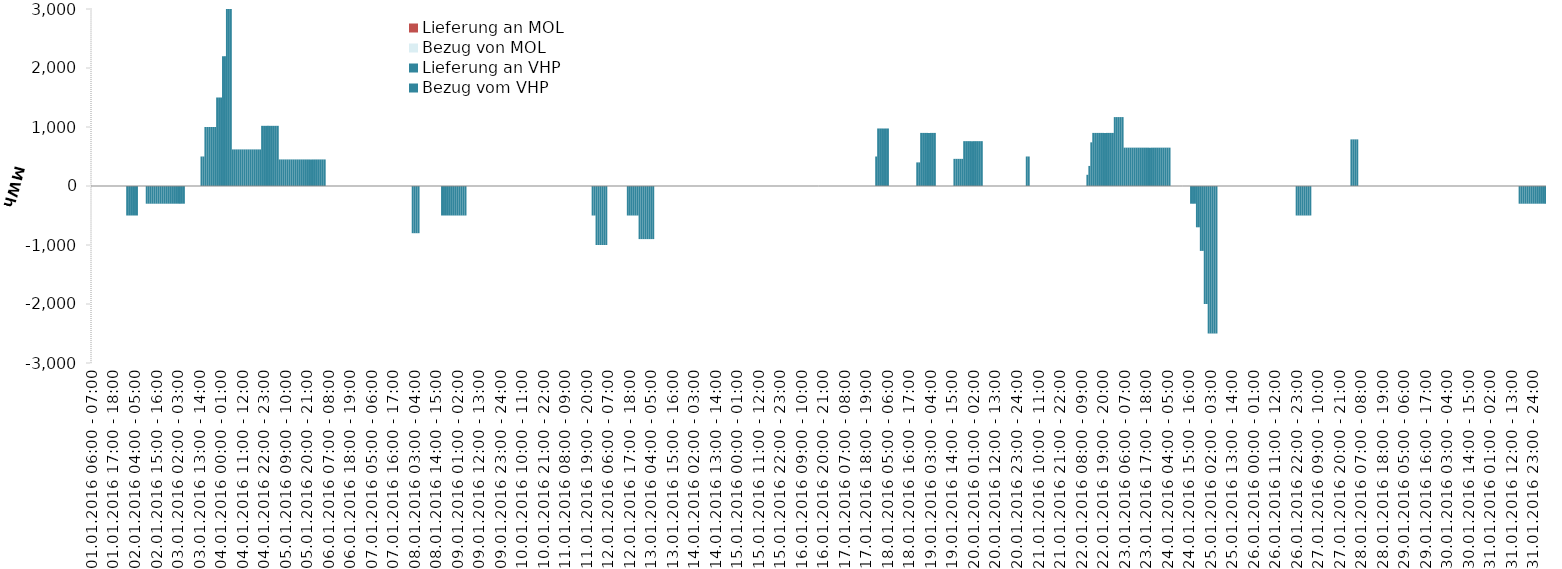
| Category | Bezug vom VHP | Lieferung an VHP | Bezug von MOL | Lieferung an MOL |
|---|---|---|---|---|
| 01.01.2016 06:00 - 07:00 | 0 | 0 | 0 | 0 |
| 01.01.2016 07:00 - 08:00 | 0 | 0 | 0 | 0 |
| 01.01.2016 08:00 - 09:00 | 0 | 0 | 0 | 0 |
| 01.01.2016 09:00 - 10:00 | 0 | 0 | 0 | 0 |
| 01.01.2016 10:00 - 11:00 | 0 | 0 | 0 | 0 |
| 01.01.2016 11:00 - 12:00 | 0 | 0 | 0 | 0 |
| 01.01.2016 12:00 - 13:00 | 0 | 0 | 0 | 0 |
| 01.01.2016 13:00 - 14:00 | 0 | 0 | 0 | 0 |
| 01.01.2016 14:00 - 15:00 | 0 | 0 | 0 | 0 |
| 01.01.2016 15:00 - 16:00 | 0 | 0 | 0 | 0 |
| 01.01.2016 16:00 - 17:00 | 0 | 0 | 0 | 0 |
| 01.01.2016 17:00 - 18:00 | 0 | 0 | 0 | 0 |
| 01.01.2016 18:00 - 19:00 | 0 | 0 | 0 | 0 |
| 01.01.2016 19:00 - 20:00 | 0 | 0 | 0 | 0 |
| 01.01.2016 20:00 - 21:00 | 0 | 0 | 0 | 0 |
| 01.01.2016 21:00 - 22:00 | 0 | 0 | 0 | 0 |
| 01.01.2016 22:00 - 23:00 | 0 | 0 | 0 | 0 |
| 01.01.2016 23:00 - 24:00 | 0 | 0 | 0 | 0 |
| 02.01.2016 00:00 - 01:00 | 0 | -500 | 0 | 0 |
| 02.01.2016 01:00 - 02:00 | 0 | -500 | 0 | 0 |
| 02.01.2016 02:00 - 03:00 | 0 | -500 | 0 | 0 |
| 02.01.2016 03:00 - 04:00 | 0 | -500 | 0 | 0 |
| 02.01.2016 04:00 - 05:00 | 0 | -500 | 0 | 0 |
| 02.01.2016 05:00 - 06:00 | 0 | -500 | 0 | 0 |
| 02.01.2016 06:00 - 07:00 | 0 | 0 | 0 | 0 |
| 02.01.2016 07:00 - 08:00 | 0 | 0 | 0 | 0 |
| 02.01.2016 08:00 - 09:00 | 0 | 0 | 0 | 0 |
| 02.01.2016 09:00 - 10:00 | 0 | 0 | 0 | 0 |
| 02.01.2016 10:00 - 11:00 | 0 | -300 | 0 | 0 |
| 02.01.2016 11:00 - 12:00 | 0 | -300 | 0 | 0 |
| 02.01.2016 12:00 - 13:00 | 0 | -300 | 0 | 0 |
| 02.01.2016 13:00 - 14:00 | 0 | -300 | 0 | 0 |
| 02.01.2016 14:00 - 15:00 | 0 | -300 | 0 | 0 |
| 02.01.2016 15:00 - 16:00 | 0 | -300 | 0 | 0 |
| 02.01.2016 16:00 - 17:00 | 0 | -300 | 0 | 0 |
| 02.01.2016 17:00 - 18:00 | 0 | -300 | 0 | 0 |
| 02.01.2016 18:00 - 19:00 | 0 | -300 | 0 | 0 |
| 02.01.2016 19:00 - 20:00 | 0 | -300 | 0 | 0 |
| 02.01.2016 20:00 - 21:00 | 0 | -300 | 0 | 0 |
| 02.01.2016 21:00 - 22:00 | 0 | -300 | 0 | 0 |
| 02.01.2016 22:00 - 23:00 | 0 | -300 | 0 | 0 |
| 02.01.2016 23:00 - 24:00 | 0 | -300 | 0 | 0 |
| 03.01.2016 00:00 - 01:00 | 0 | -300 | 0 | 0 |
| 03.01.2016 01:00 - 02:00 | 0 | -300 | 0 | 0 |
| 03.01.2016 02:00 - 03:00 | 0 | -300 | 0 | 0 |
| 03.01.2016 03:00 - 04:00 | 0 | -300 | 0 | 0 |
| 03.01.2016 04:00 - 05:00 | 0 | -300 | 0 | 0 |
| 03.01.2016 05:00 - 06:00 | 0 | -300 | 0 | 0 |
| 03.01.2016 06:00 - 07:00 | 0 | 0 | 0 | 0 |
| 03.01.2016 07:00 - 08:00 | 0 | 0 | 0 | 0 |
| 03.01.2016 08:00 - 09:00 | 0 | 0 | 0 | 0 |
| 03.01.2016 09:00 - 10:00 | 0 | 0 | 0 | 0 |
| 03.01.2016 10:00 - 11:00 | 0 | 0 | 0 | 0 |
| 03.01.2016 11:00 - 12:00 | 0 | 0 | 0 | 0 |
| 03.01.2016 12:00 - 13:00 | 0 | 0 | 0 | 0 |
| 03.01.2016 13:00 - 14:00 | 0 | 0 | 0 | 0 |
| 03.01.2016 14:00 - 15:00 | 500 | 0 | 0 | 0 |
| 03.01.2016 15:00 - 16:00 | 500 | 0 | 0 | 0 |
| 03.01.2016 16:00 - 17:00 | 1000 | 0 | 0 | 0 |
| 03.01.2016 17:00 - 18:00 | 1000 | 0 | 0 | 0 |
| 03.01.2016 18:00 - 19:00 | 1000 | 0 | 0 | 0 |
| 03.01.2016 19:00 - 20:00 | 1000 | 0 | 0 | 0 |
| 03.01.2016 20:00 - 21:00 | 1000 | 0 | 0 | 0 |
| 03.01.2016 21:00 - 22:00 | 1000 | 0 | 0 | 0 |
| 03.01.2016 22:00 - 23:00 | 1500 | 0 | 0 | 0 |
| 03.01.2016 23:00 - 24:00 | 1500 | 0 | 0 | 0 |
| 04.01.2016 00:00 - 01:00 | 1500 | 0 | 0 | 0 |
| 04.01.2016 01:00 - 02:00 | 2200 | 0 | 0 | 0 |
| 04.01.2016 02:00 - 03:00 | 2200 | 0 | 0 | 0 |
| 04.01.2016 03:00 - 04:00 | 3100 | 0 | 0 | 0 |
| 04.01.2016 04:00 - 05:00 | 3100 | 0 | 0 | 0 |
| 04.01.2016 05:00 - 06:00 | 3100 | 0 | 0 | 0 |
| 04.01.2016 06:00 - 07:00 | 620 | 0 | 0 | 0 |
| 04.01.2016 07:00 - 08:00 | 620 | 0 | 0 | 0 |
| 04.01.2016 08:00 - 09:00 | 620 | 0 | 0 | 0 |
| 04.01.2016 09:00 - 10:00 | 620 | 0 | 0 | 0 |
| 04.01.2016 10:00 - 11:00 | 620 | 0 | 0 | 0 |
| 04.01.2016 11:00 - 12:00 | 620 | 0 | 0 | 0 |
| 04.01.2016 12:00 - 13:00 | 620 | 0 | 0 | 0 |
| 04.01.2016 13:00 - 14:00 | 620 | 0 | 0 | 0 |
| 04.01.2016 14:00 - 15:00 | 620 | 0 | 0 | 0 |
| 04.01.2016 15:00 - 16:00 | 620 | 0 | 0 | 0 |
| 04.01.2016 16:00 - 17:00 | 620 | 0 | 0 | 0 |
| 04.01.2016 17:00 - 18:00 | 620 | 0 | 0 | 0 |
| 04.01.2016 18:00 - 19:00 | 620 | 0 | 0 | 0 |
| 04.01.2016 19:00 - 20:00 | 620 | 0 | 0 | 0 |
| 04.01.2016 20:00 - 21:00 | 620 | 0 | 0 | 0 |
| 04.01.2016 21:00 - 22:00 | 1020 | 0 | 0 | 0 |
| 04.01.2016 22:00 - 23:00 | 1020 | 0 | 0 | 0 |
| 04.01.2016 23:00 - 24:00 | 1020 | 0 | 0 | 0 |
| 05.01.2016 00:00 - 01:00 | 1020 | 0 | 0 | 0 |
| 05.01.2016 01:00 - 02:00 | 1020 | 0 | 0 | 0 |
| 05.01.2016 02:00 - 03:00 | 1020 | 0 | 0 | 0 |
| 05.01.2016 03:00 - 04:00 | 1020 | 0 | 0 | 0 |
| 05.01.2016 04:00 - 05:00 | 1020 | 0 | 0 | 0 |
| 05.01.2016 05:00 - 06:00 | 1020 | 0 | 0 | 0 |
| 05.01.2016 06:00 - 07:00 | 450 | 0 | 0 | 0 |
| 05.01.2016 07:00 - 08:00 | 450 | 0 | 0 | 0 |
| 05.01.2016 08:00 - 09:00 | 450 | 0 | 0 | 0 |
| 05.01.2016 09:00 - 10:00 | 450 | 0 | 0 | 0 |
| 05.01.2016 10:00 - 11:00 | 450 | 0 | 0 | 0 |
| 05.01.2016 11:00 - 12:00 | 450 | 0 | 0 | 0 |
| 05.01.2016 12:00 - 13:00 | 450 | 0 | 0 | 0 |
| 05.01.2016 13:00 - 14:00 | 450 | 0 | 0 | 0 |
| 05.01.2016 14:00 - 15:00 | 450 | 0 | 0 | 0 |
| 05.01.2016 15:00 - 16:00 | 450 | 0 | 0 | 0 |
| 05.01.2016 16:00 - 17:00 | 450 | 0 | 0 | 0 |
| 05.01.2016 17:00 - 18:00 | 450 | 0 | 0 | 0 |
| 05.01.2016 18:00 - 19:00 | 450 | 0 | 0 | 0 |
| 05.01.2016 19:00 - 20:00 | 450 | 0 | 0 | 0 |
| 05.01.2016 20:00 - 21:00 | 450 | 0 | 0 | 0 |
| 05.01.2016 21:00 - 22:00 | 450 | 0 | 0 | 0 |
| 05.01.2016 22:00 - 23:00 | 450 | 0 | 0 | 0 |
| 05.01.2016 23:00 - 24:00 | 450 | 0 | 0 | 0 |
| 06.01.2016 00:00 - 01:00 | 450 | 0 | 0 | 0 |
| 06.01.2016 01:00 - 02:00 | 450 | 0 | 0 | 0 |
| 06.01.2016 02:00 - 03:00 | 450 | 0 | 0 | 0 |
| 06.01.2016 03:00 - 04:00 | 450 | 0 | 0 | 0 |
| 06.01.2016 04:00 - 05:00 | 450 | 0 | 0 | 0 |
| 06.01.2016 05:00 - 06:00 | 450 | 0 | 0 | 0 |
| 06.01.2016 06:00 - 07:00 | 0 | 0 | 0 | 0 |
| 06.01.2016 07:00 - 08:00 | 0 | 0 | 0 | 0 |
| 06.01.2016 08:00 - 09:00 | 0 | 0 | 0 | 0 |
| 06.01.2016 09:00 - 10:00 | 0 | 0 | 0 | 0 |
| 06.01.2016 10:00 - 11:00 | 0 | 0 | 0 | 0 |
| 06.01.2016 11:00 - 12:00 | 0 | 0 | 0 | 0 |
| 06.01.2016 12:00 - 13:00 | 0 | 0 | 0 | 0 |
| 06.01.2016 13:00 - 14:00 | 0 | 0 | 0 | 0 |
| 06.01.2016 14:00 - 15:00 | 0 | 0 | 0 | 0 |
| 06.01.2016 15:00 - 16:00 | 0 | 0 | 0 | 0 |
| 06.01.2016 16:00 - 17:00 | 0 | 0 | 0 | 0 |
| 06.01.2016 17:00 - 18:00 | 0 | 0 | 0 | 0 |
| 06.01.2016 18:00 - 19:00 | 0 | 0 | 0 | 0 |
| 06.01.2016 19:00 - 20:00 | 0 | 0 | 0 | 0 |
| 06.01.2016 20:00 - 21:00 | 0 | 0 | 0 | 0 |
| 06.01.2016 21:00 - 22:00 | 0 | 0 | 0 | 0 |
| 06.01.2016 22:00 - 23:00 | 0 | 0 | 0 | 0 |
| 06.01.2016 23:00 - 24:00 | 0 | 0 | 0 | 0 |
| 07.01.2016 00:00 - 01:00 | 0 | 0 | 0 | 0 |
| 07.01.2016 01:00 - 02:00 | 0 | 0 | 0 | 0 |
| 07.01.2016 02:00 - 03:00 | 0 | 0 | 0 | 0 |
| 07.01.2016 03:00 - 04:00 | 0 | 0 | 0 | 0 |
| 07.01.2016 04:00 - 05:00 | 0 | 0 | 0 | 0 |
| 07.01.2016 05:00 - 06:00 | 0 | 0 | 0 | 0 |
| 07.01.2016 06:00 - 07:00 | 0 | 0 | 0 | 0 |
| 07.01.2016 07:00 - 08:00 | 0 | 0 | 0 | 0 |
| 07.01.2016 08:00 - 09:00 | 0 | 0 | 0 | 0 |
| 07.01.2016 09:00 - 10:00 | 0 | 0 | 0 | 0 |
| 07.01.2016 10:00 - 11:00 | 0 | 0 | 0 | 0 |
| 07.01.2016 11:00 - 12:00 | 0 | 0 | 0 | 0 |
| 07.01.2016 12:00 - 13:00 | 0 | 0 | 0 | 0 |
| 07.01.2016 13:00 - 14:00 | 0 | 0 | 0 | 0 |
| 07.01.2016 14:00 - 15:00 | 0 | 0 | 0 | 0 |
| 07.01.2016 15:00 - 16:00 | 0 | 0 | 0 | 0 |
| 07.01.2016 16:00 - 17:00 | 0 | 0 | 0 | 0 |
| 07.01.2016 17:00 - 18:00 | 0 | 0 | 0 | 0 |
| 07.01.2016 18:00 - 19:00 | 0 | 0 | 0 | 0 |
| 07.01.2016 19:00 - 20:00 | 0 | 0 | 0 | 0 |
| 07.01.2016 20:00 - 21:00 | 0 | 0 | 0 | 0 |
| 07.01.2016 21:00 - 22:00 | 0 | 0 | 0 | 0 |
| 07.01.2016 22:00 - 23:00 | 0 | 0 | 0 | 0 |
| 07.01.2016 23:00 - 24:00 | 0 | 0 | 0 | 0 |
| 08.01.2016 00:00 - 01:00 | 0 | 0 | 0 | 0 |
| 08.01.2016 01:00 - 02:00 | 0 | 0 | 0 | 0 |
| 08.01.2016 02:00 - 03:00 | 0 | -800 | 0 | 0 |
| 08.01.2016 03:00 - 04:00 | 0 | -800 | 0 | 0 |
| 08.01.2016 04:00 - 05:00 | 0 | -800 | 0 | 0 |
| 08.01.2016 05:00 - 06:00 | 0 | -800 | 0 | 0 |
| 08.01.2016 06:00 - 07:00 | 0 | 0 | 0 | 0 |
| 08.01.2016 07:00 - 08:00 | 0 | 0 | 0 | 0 |
| 08.01.2016 08:00 - 09:00 | 0 | 0 | 0 | 0 |
| 08.01.2016 09:00 - 10:00 | 0 | 0 | 0 | 0 |
| 08.01.2016 10:00 - 11:00 | 0 | 0 | 0 | 0 |
| 08.01.2016 11:00 - 12:00 | 0 | 0 | 0 | 0 |
| 08.01.2016 12:00 - 13:00 | 0 | 0 | 0 | 0 |
| 08.01.2016 13:00 - 14:00 | 0 | 0 | 0 | 0 |
| 08.01.2016 14:00 - 15:00 | 0 | 0 | 0 | 0 |
| 08.01.2016 15:00 - 16:00 | 0 | 0 | 0 | 0 |
| 08.01.2016 16:00 - 17:00 | 0 | 0 | 0 | 0 |
| 08.01.2016 17:00 - 18:00 | 0 | -500 | 0 | 0 |
| 08.01.2016 18:00 - 19:00 | 0 | -500 | 0 | 0 |
| 08.01.2016 19:00 - 20:00 | 0 | -500 | 0 | 0 |
| 08.01.2016 20:00 - 21:00 | 0 | -500 | 0 | 0 |
| 08.01.2016 21:00 - 22:00 | 0 | -500 | 0 | 0 |
| 08.01.2016 22:00 - 23:00 | 0 | -500 | 0 | 0 |
| 08.01.2016 23:00 - 24:00 | 0 | -500 | 0 | 0 |
| 09.01.2016 00:00 - 01:00 | 0 | -500 | 0 | 0 |
| 09.01.2016 01:00 - 02:00 | 0 | -500 | 0 | 0 |
| 09.01.2016 02:00 - 03:00 | 0 | -500 | 0 | 0 |
| 09.01.2016 03:00 - 04:00 | 0 | -500 | 0 | 0 |
| 09.01.2016 04:00 - 05:00 | 0 | -500 | 0 | 0 |
| 09.01.2016 05:00 - 06:00 | 0 | -500 | 0 | 0 |
| 09.01.2016 06:00 - 07:00 | 0 | 0 | 0 | 0 |
| 09.01.2016 07:00 - 08:00 | 0 | 0 | 0 | 0 |
| 09.01.2016 08:00 - 09:00 | 0 | 0 | 0 | 0 |
| 09.01.2016 09:00 - 10:00 | 0 | 0 | 0 | 0 |
| 09.01.2016 10:00 - 11:00 | 0 | 0 | 0 | 0 |
| 09.01.2016 11:00 - 12:00 | 0 | 0 | 0 | 0 |
| 09.01.2016 12:00 - 13:00 | 0 | 0 | 0 | 0 |
| 09.01.2016 13:00 - 14:00 | 0 | 0 | 0 | 0 |
| 09.01.2016 14:00 - 15:00 | 0 | 0 | 0 | 0 |
| 09.01.2016 15:00 - 16:00 | 0 | 0 | 0 | 0 |
| 09.01.2016 16:00 - 17:00 | 0 | 0 | 0 | 0 |
| 09.01.2016 17:00 - 18:00 | 0 | 0 | 0 | 0 |
| 09.01.2016 18:00 - 19:00 | 0 | 0 | 0 | 0 |
| 09.01.2016 19:00 - 20:00 | 0 | 0 | 0 | 0 |
| 09.01.2016 20:00 - 21:00 | 0 | 0 | 0 | 0 |
| 09.01.2016 21:00 - 22:00 | 0 | 0 | 0 | 0 |
| 09.01.2016 22:00 - 23:00 | 0 | 0 | 0 | 0 |
| 09.01.2016 23:00 - 24:00 | 0 | 0 | 0 | 0 |
| 10.01.2016 00:00 - 01:00 | 0 | 0 | 0 | 0 |
| 10.01.2016 01:00 - 02:00 | 0 | 0 | 0 | 0 |
| 10.01.2016 02:00 - 03:00 | 0 | 0 | 0 | 0 |
| 10.01.2016 03:00 - 04:00 | 0 | 0 | 0 | 0 |
| 10.01.2016 04:00 - 05:00 | 0 | 0 | 0 | 0 |
| 10.01.2016 05:00 - 06:00 | 0 | 0 | 0 | 0 |
| 10.01.2016 06:00 - 07:00 | 0 | 0 | 0 | 0 |
| 10.01.2016 07:00 - 08:00 | 0 | 0 | 0 | 0 |
| 10.01.2016 08:00 - 09:00 | 0 | 0 | 0 | 0 |
| 10.01.2016 09:00 - 10:00 | 0 | 0 | 0 | 0 |
| 10.01.2016 10:00 - 11:00 | 0 | 0 | 0 | 0 |
| 10.01.2016 11:00 - 12:00 | 0 | 0 | 0 | 0 |
| 10.01.2016 12:00 - 13:00 | 0 | 0 | 0 | 0 |
| 10.01.2016 13:00 - 14:00 | 0 | 0 | 0 | 0 |
| 10.01.2016 14:00 - 15:00 | 0 | 0 | 0 | 0 |
| 10.01.2016 15:00 - 16:00 | 0 | 0 | 0 | 0 |
| 10.01.2016 16:00 - 17:00 | 0 | 0 | 0 | 0 |
| 10.01.2016 17:00 - 18:00 | 0 | 0 | 0 | 0 |
| 10.01.2016 18:00 - 19:00 | 0 | 0 | 0 | 0 |
| 10.01.2016 19:00 - 20:00 | 0 | 0 | 0 | 0 |
| 10.01.2016 20:00 - 21:00 | 0 | 0 | 0 | 0 |
| 10.01.2016 21:00 - 22:00 | 0 | 0 | 0 | 0 |
| 10.01.2016 22:00 - 23:00 | 0 | 0 | 0 | 0 |
| 10.01.2016 23:00 - 24:00 | 0 | 0 | 0 | 0 |
| 11.01.2016 00:00 - 01:00 | 0 | 0 | 0 | 0 |
| 11.01.2016 01:00 - 02:00 | 0 | 0 | 0 | 0 |
| 11.01.2016 02:00 - 03:00 | 0 | 0 | 0 | 0 |
| 11.01.2016 03:00 - 04:00 | 0 | 0 | 0 | 0 |
| 11.01.2016 04:00 - 05:00 | 0 | 0 | 0 | 0 |
| 11.01.2016 05:00 - 06:00 | 0 | 0 | 0 | 0 |
| 11.01.2016 06:00 - 07:00 | 0 | 0 | 0 | 0 |
| 11.01.2016 07:00 - 08:00 | 0 | 0 | 0 | 0 |
| 11.01.2016 08:00 - 09:00 | 0 | 0 | 0 | 0 |
| 11.01.2016 09:00 - 10:00 | 0 | 0 | 0 | 0 |
| 11.01.2016 10:00 - 11:00 | 0 | 0 | 0 | 0 |
| 11.01.2016 11:00 - 12:00 | 0 | 0 | 0 | 0 |
| 11.01.2016 12:00 - 13:00 | 0 | 0 | 0 | 0 |
| 11.01.2016 13:00 - 14:00 | 0 | 0 | 0 | 0 |
| 11.01.2016 14:00 - 15:00 | 0 | 0 | 0 | 0 |
| 11.01.2016 15:00 - 16:00 | 0 | 0 | 0 | 0 |
| 11.01.2016 16:00 - 17:00 | 0 | 0 | 0 | 0 |
| 11.01.2016 17:00 - 18:00 | 0 | 0 | 0 | 0 |
| 11.01.2016 18:00 - 19:00 | 0 | 0 | 0 | 0 |
| 11.01.2016 19:00 - 20:00 | 0 | 0 | 0 | 0 |
| 11.01.2016 20:00 - 21:00 | 0 | 0 | 0 | 0 |
| 11.01.2016 21:00 - 22:00 | 0 | 0 | 0 | 0 |
| 11.01.2016 22:00 - 23:00 | 0 | -500 | 0 | 0 |
| 11.01.2016 23:00 - 24:00 | 0 | -500 | 0 | 0 |
| 12.01.2016 00:00 - 01:00 | 0 | -1000 | 0 | 0 |
| 12.01.2016 01:00 - 02:00 | 0 | -1000 | 0 | 0 |
| 12.01.2016 02:00 - 03:00 | 0 | -1000 | 0 | 0 |
| 12.01.2016 03:00 - 04:00 | 0 | -1000 | 0 | 0 |
| 12.01.2016 04:00 - 05:00 | 0 | -1000 | 0 | 0 |
| 12.01.2016 05:00 - 06:00 | 0 | -1000 | 0 | 0 |
| 12.01.2016 06:00 - 07:00 | 0 | 0 | 0 | 0 |
| 12.01.2016 07:00 - 08:00 | 0 | 0 | 0 | 0 |
| 12.01.2016 08:00 - 09:00 | 0 | 0 | 0 | 0 |
| 12.01.2016 09:00 - 10:00 | 0 | 0 | 0 | 0 |
| 12.01.2016 10:00 - 11:00 | 0 | 0 | 0 | 0 |
| 12.01.2016 11:00 - 12:00 | 0 | 0 | 0 | 0 |
| 12.01.2016 12:00 - 13:00 | 0 | 0 | 0 | 0 |
| 12.01.2016 13:00 - 14:00 | 0 | 0 | 0 | 0 |
| 12.01.2016 14:00 - 15:00 | 0 | 0 | 0 | 0 |
| 12.01.2016 15:00 - 16:00 | 0 | 0 | 0 | 0 |
| 12.01.2016 16:00 - 17:00 | 0 | -500 | 0 | 0 |
| 12.01.2016 17:00 - 18:00 | 0 | -500 | 0 | 0 |
| 12.01.2016 18:00 - 19:00 | 0 | -500 | 0 | 0 |
| 12.01.2016 19:00 - 20:00 | 0 | -500 | 0 | 0 |
| 12.01.2016 20:00 - 21:00 | 0 | -500 | 0 | 0 |
| 12.01.2016 21:00 - 22:00 | 0 | -500 | 0 | 0 |
| 12.01.2016 22:00 - 23:00 | 0 | -900 | 0 | 0 |
| 12.01.2016 23:00 - 24:00 | 0 | -900 | 0 | 0 |
| 13.01.2016 00:00 - 01:00 | 0 | -900 | 0 | 0 |
| 13.01.2016 01:00 - 02:00 | 0 | -900 | 0 | 0 |
| 13.01.2016 02:00 - 03:00 | 0 | -900 | 0 | 0 |
| 13.01.2016 03:00 - 04:00 | 0 | -900 | 0 | 0 |
| 13.01.2016 04:00 - 05:00 | 0 | -900 | 0 | 0 |
| 13.01.2016 05:00 - 06:00 | 0 | -900 | 0 | 0 |
| 13.01.2016 06:00 - 07:00 | 0 | 0 | 0 | 0 |
| 13.01.2016 07:00 - 08:00 | 0 | 0 | 0 | 0 |
| 13.01.2016 08:00 - 09:00 | 0 | 0 | 0 | 0 |
| 13.01.2016 09:00 - 10:00 | 0 | 0 | 0 | 0 |
| 13.01.2016 10:00 - 11:00 | 0 | 0 | 0 | 0 |
| 13.01.2016 11:00 - 12:00 | 0 | 0 | 0 | 0 |
| 13.01.2016 12:00 - 13:00 | 0 | 0 | 0 | 0 |
| 13.01.2016 13:00 - 14:00 | 0 | 0 | 0 | 0 |
| 13.01.2016 14:00 - 15:00 | 0 | 0 | 0 | 0 |
| 13.01.2016 15:00 - 16:00 | 0 | 0 | 0 | 0 |
| 13.01.2016 16:00 - 17:00 | 0 | 0 | 0 | 0 |
| 13.01.2016 17:00 - 18:00 | 0 | 0 | 0 | 0 |
| 13.01.2016 18:00 - 19:00 | 0 | 0 | 0 | 0 |
| 13.01.2016 19:00 - 20:00 | 0 | 0 | 0 | 0 |
| 13.01.2016 20:00 - 21:00 | 0 | 0 | 0 | 0 |
| 13.01.2016 21:00 - 22:00 | 0 | 0 | 0 | 0 |
| 13.01.2016 22:00 - 23:00 | 0 | 0 | 0 | 0 |
| 13.01.2016 23:00 - 24:00 | 0 | 0 | 0 | 0 |
| 14.01.2016 00:00 - 01:00 | 0 | 0 | 0 | 0 |
| 14.01.2016 01:00 - 02:00 | 0 | 0 | 0 | 0 |
| 14.01.2016 02:00 - 03:00 | 0 | 0 | 0 | 0 |
| 14.01.2016 03:00 - 04:00 | 0 | 0 | 0 | 0 |
| 14.01.2016 04:00 - 05:00 | 0 | 0 | 0 | 0 |
| 14.01.2016 05:00 - 06:00 | 0 | 0 | 0 | 0 |
| 14.01.2016 06:00 - 07:00 | 0 | 0 | 0 | 0 |
| 14.01.2016 07:00 - 08:00 | 0 | 0 | 0 | 0 |
| 14.01.2016 08:00 - 09:00 | 0 | 0 | 0 | 0 |
| 14.01.2016 09:00 - 10:00 | 0 | 0 | 0 | 0 |
| 14.01.2016 10:00 - 11:00 | 0 | 0 | 0 | 0 |
| 14.01.2016 11:00 - 12:00 | 0 | 0 | 0 | 0 |
| 14.01.2016 12:00 - 13:00 | 0 | 0 | 0 | 0 |
| 14.01.2016 13:00 - 14:00 | 0 | 0 | 0 | 0 |
| 14.01.2016 14:00 - 15:00 | 0 | 0 | 0 | 0 |
| 14.01.2016 15:00 - 16:00 | 0 | 0 | 0 | 0 |
| 14.01.2016 16:00 - 17:00 | 0 | 0 | 0 | 0 |
| 14.01.2016 17:00 - 18:00 | 0 | 0 | 0 | 0 |
| 14.01.2016 18:00 - 19:00 | 0 | 0 | 0 | 0 |
| 14.01.2016 19:00 - 20:00 | 0 | 0 | 0 | 0 |
| 14.01.2016 20:00 - 21:00 | 0 | 0 | 0 | 0 |
| 14.01.2016 21:00 - 22:00 | 0 | 0 | 0 | 0 |
| 14.01.2016 22:00 - 23:00 | 0 | 0 | 0 | 0 |
| 14.01.2016 23:00 - 24:00 | 0 | 0 | 0 | 0 |
| 15.01.2016 00:00 - 01:00 | 0 | 0 | 0 | 0 |
| 15.01.2016 01:00 - 02:00 | 0 | 0 | 0 | 0 |
| 15.01.2016 02:00 - 03:00 | 0 | 0 | 0 | 0 |
| 15.01.2016 03:00 - 04:00 | 0 | 0 | 0 | 0 |
| 15.01.2016 04:00 - 05:00 | 0 | 0 | 0 | 0 |
| 15.01.2016 05:00 - 06:00 | 0 | 0 | 0 | 0 |
| 15.01.2016 06:00 - 07:00 | 0 | 0 | 0 | 0 |
| 15.01.2016 07:00 - 08:00 | 0 | 0 | 0 | 0 |
| 15.01.2016 08:00 - 09:00 | 0 | 0 | 0 | 0 |
| 15.01.2016 09:00 - 10:00 | 0 | 0 | 0 | 0 |
| 15.01.2016 10:00 - 11:00 | 0 | 0 | 0 | 0 |
| 15.01.2016 11:00 - 12:00 | 0 | 0 | 0 | 0 |
| 15.01.2016 12:00 - 13:00 | 0 | 0 | 0 | 0 |
| 15.01.2016 13:00 - 14:00 | 0 | 0 | 0 | 0 |
| 15.01.2016 14:00 - 15:00 | 0 | 0 | 0 | 0 |
| 15.01.2016 15:00 - 16:00 | 0 | 0 | 0 | 0 |
| 15.01.2016 16:00 - 17:00 | 0 | 0 | 0 | 0 |
| 15.01.2016 17:00 - 18:00 | 0 | 0 | 0 | 0 |
| 15.01.2016 18:00 - 19:00 | 0 | 0 | 0 | 0 |
| 15.01.2016 19:00 - 20:00 | 0 | 0 | 0 | 0 |
| 15.01.2016 20:00 - 21:00 | 0 | 0 | 0 | 0 |
| 15.01.2016 21:00 - 22:00 | 0 | 0 | 0 | 0 |
| 15.01.2016 22:00 - 23:00 | 0 | 0 | 0 | 0 |
| 15.01.2016 23:00 - 24:00 | 0 | 0 | 0 | 0 |
| 16.01.2016 00:00 - 01:00 | 0 | 0 | 0 | 0 |
| 16.01.2016 01:00 - 02:00 | 0 | 0 | 0 | 0 |
| 16.01.2016 02:00 - 03:00 | 0 | 0 | 0 | 0 |
| 16.01.2016 03:00 - 04:00 | 0 | 0 | 0 | 0 |
| 16.01.2016 04:00 - 05:00 | 0 | 0 | 0 | 0 |
| 16.01.2016 05:00 - 06:00 | 0 | 0 | 0 | 0 |
| 16.01.2016 06:00 - 07:00 | 0 | 0 | 0 | 0 |
| 16.01.2016 07:00 - 08:00 | 0 | 0 | 0 | 0 |
| 16.01.2016 08:00 - 09:00 | 0 | 0 | 0 | 0 |
| 16.01.2016 09:00 - 10:00 | 0 | 0 | 0 | 0 |
| 16.01.2016 10:00 - 11:00 | 0 | 0 | 0 | 0 |
| 16.01.2016 11:00 - 12:00 | 0 | 0 | 0 | 0 |
| 16.01.2016 12:00 - 13:00 | 0 | 0 | 0 | 0 |
| 16.01.2016 13:00 - 14:00 | 0 | 0 | 0 | 0 |
| 16.01.2016 14:00 - 15:00 | 0 | 0 | 0 | 0 |
| 16.01.2016 15:00 - 16:00 | 0 | 0 | 0 | 0 |
| 16.01.2016 16:00 - 17:00 | 0 | 0 | 0 | 0 |
| 16.01.2016 17:00 - 18:00 | 0 | 0 | 0 | 0 |
| 16.01.2016 18:00 - 19:00 | 0 | 0 | 0 | 0 |
| 16.01.2016 19:00 - 20:00 | 0 | 0 | 0 | 0 |
| 16.01.2016 20:00 - 21:00 | 0 | 0 | 0 | 0 |
| 16.01.2016 21:00 - 22:00 | 0 | 0 | 0 | 0 |
| 16.01.2016 22:00 - 23:00 | 0 | 0 | 0 | 0 |
| 16.01.2016 23:00 - 24:00 | 0 | 0 | 0 | 0 |
| 17.01.2016 00:00 - 01:00 | 0 | 0 | 0 | 0 |
| 17.01.2016 01:00 - 02:00 | 0 | 0 | 0 | 0 |
| 17.01.2016 02:00 - 03:00 | 0 | 0 | 0 | 0 |
| 17.01.2016 03:00 - 04:00 | 0 | 0 | 0 | 0 |
| 17.01.2016 04:00 - 05:00 | 0 | 0 | 0 | 0 |
| 17.01.2016 05:00 - 06:00 | 0 | 0 | 0 | 0 |
| 17.01.2016 06:00 - 07:00 | 0 | 0 | 0 | 0 |
| 17.01.2016 07:00 - 08:00 | 0 | 0 | 0 | 0 |
| 17.01.2016 08:00 - 09:00 | 0 | 0 | 0 | 0 |
| 17.01.2016 09:00 - 10:00 | 0 | 0 | 0 | 0 |
| 17.01.2016 10:00 - 11:00 | 0 | 0 | 0 | 0 |
| 17.01.2016 11:00 - 12:00 | 0 | 0 | 0 | 0 |
| 17.01.2016 12:00 - 13:00 | 0 | 0 | 0 | 0 |
| 17.01.2016 13:00 - 14:00 | 0 | 0 | 0 | 0 |
| 17.01.2016 14:00 - 15:00 | 0 | 0 | 0 | 0 |
| 17.01.2016 15:00 - 16:00 | 0 | 0 | 0 | 0 |
| 17.01.2016 16:00 - 17:00 | 0 | 0 | 0 | 0 |
| 17.01.2016 17:00 - 18:00 | 0 | 0 | 0 | 0 |
| 17.01.2016 18:00 - 19:00 | 0 | 0 | 0 | 0 |
| 17.01.2016 19:00 - 20:00 | 0 | 0 | 0 | 0 |
| 17.01.2016 20:00 - 21:00 | 0 | 0 | 0 | 0 |
| 17.01.2016 21:00 - 22:00 | 0 | 0 | 0 | 0 |
| 17.01.2016 22:00 - 23:00 | 0 | 0 | 0 | 0 |
| 17.01.2016 23:00 - 24:00 | 500 | 0 | 0 | 0 |
| 18.01.2016 00:00 - 01:00 | 975 | 0 | 0 | 0 |
| 18.01.2016 01:00 - 02:00 | 975 | 0 | 0 | 0 |
| 18.01.2016 02:00 - 03:00 | 975 | 0 | 0 | 0 |
| 18.01.2016 03:00 - 04:00 | 975 | 0 | 0 | 0 |
| 18.01.2016 04:00 - 05:00 | 975 | 0 | 0 | 0 |
| 18.01.2016 05:00 - 06:00 | 975 | 0 | 0 | 0 |
| 18.01.2016 06:00 - 07:00 | 0 | 0 | 0 | 0 |
| 18.01.2016 07:00 - 08:00 | 0 | 0 | 0 | 0 |
| 18.01.2016 08:00 - 09:00 | 0 | 0 | 0 | 0 |
| 18.01.2016 09:00 - 10:00 | 0 | 0 | 0 | 0 |
| 18.01.2016 10:00 - 11:00 | 0 | 0 | 0 | 0 |
| 18.01.2016 11:00 - 12:00 | 0 | 0 | 0 | 0 |
| 18.01.2016 12:00 - 13:00 | 0 | 0 | 0 | 0 |
| 18.01.2016 13:00 - 14:00 | 0 | 0 | 0 | 0 |
| 18.01.2016 14:00 - 15:00 | 0 | 0 | 0 | 0 |
| 18.01.2016 15:00 - 16:00 | 0 | 0 | 0 | 0 |
| 18.01.2016 16:00 - 17:00 | 0 | 0 | 0 | 0 |
| 18.01.2016 17:00 - 18:00 | 0 | 0 | 0 | 0 |
| 18.01.2016 18:00 - 19:00 | 0 | 0 | 0 | 0 |
| 18.01.2016 19:00 - 20:00 | 0 | 0 | 0 | 0 |
| 18.01.2016 20:00 - 21:00 | 400 | 0 | 0 | 0 |
| 18.01.2016 21:00 - 22:00 | 400 | 0 | 0 | 0 |
| 18.01.2016 22:00 - 23:00 | 900 | 0 | 0 | 0 |
| 18.01.2016 23:00 - 24:00 | 900 | 0 | 0 | 0 |
| 19.01.2016 00:00 - 01:00 | 900 | 0 | 0 | 0 |
| 19.01.2016 01:00 - 02:00 | 900 | 0 | 0 | 0 |
| 19.01.2016 02:00 - 03:00 | 900 | 0 | 0 | 0 |
| 19.01.2016 03:00 - 04:00 | 900 | 0 | 0 | 0 |
| 19.01.2016 04:00 - 05:00 | 900 | 0 | 0 | 0 |
| 19.01.2016 05:00 - 06:00 | 900 | 0 | 0 | 0 |
| 19.01.2016 06:00 - 07:00 | 0 | 0 | 0 | 0 |
| 19.01.2016 07:00 - 08:00 | 0 | 0 | 0 | 0 |
| 19.01.2016 08:00 - 09:00 | 0 | 0 | 0 | 0 |
| 19.01.2016 09:00 - 10:00 | 0 | 0 | 0 | 0 |
| 19.01.2016 10:00 - 11:00 | 0 | 0 | 0 | 0 |
| 19.01.2016 11:00 - 12:00 | 0 | 0 | 0 | 0 |
| 19.01.2016 12:00 - 13:00 | 0 | 0 | 0 | 0 |
| 19.01.2016 13:00 - 14:00 | 0 | 0 | 0 | 0 |
| 19.01.2016 14:00 - 15:00 | 0 | 0 | 0 | 0 |
| 19.01.2016 15:00 - 16:00 | 460 | 0 | 0 | 0 |
| 19.01.2016 16:00 - 17:00 | 460 | 0 | 0 | 0 |
| 19.01.2016 17:00 - 18:00 | 460 | 0 | 0 | 0 |
| 19.01.2016 18:00 - 19:00 | 460 | 0 | 0 | 0 |
| 19.01.2016 19:00 - 20:00 | 460 | 0 | 0 | 0 |
| 19.01.2016 20:00 - 21:00 | 760 | 0 | 0 | 0 |
| 19.01.2016 21:00 - 22:00 | 760 | 0 | 0 | 0 |
| 19.01.2016 22:00 - 23:00 | 760 | 0 | 0 | 0 |
| 19.01.2016 23:00 - 24:00 | 760 | 0 | 0 | 0 |
| 20.01.2016 00:00 - 01:00 | 760 | 0 | 0 | 0 |
| 20.01.2016 01:00 - 02:00 | 760 | 0 | 0 | 0 |
| 20.01.2016 02:00 - 03:00 | 760 | 0 | 0 | 0 |
| 20.01.2016 03:00 - 04:00 | 760 | 0 | 0 | 0 |
| 20.01.2016 04:00 - 05:00 | 760 | 0 | 0 | 0 |
| 20.01.2016 05:00 - 06:00 | 760 | 0 | 0 | 0 |
| 20.01.2016 06:00 - 07:00 | 0 | 0 | 0 | 0 |
| 20.01.2016 07:00 - 08:00 | 0 | 0 | 0 | 0 |
| 20.01.2016 08:00 - 09:00 | 0 | 0 | 0 | 0 |
| 20.01.2016 09:00 - 10:00 | 0 | 0 | 0 | 0 |
| 20.01.2016 10:00 - 11:00 | 0 | 0 | 0 | 0 |
| 20.01.2016 11:00 - 12:00 | 0 | 0 | 0 | 0 |
| 20.01.2016 12:00 - 13:00 | 0 | 0 | 0 | 0 |
| 20.01.2016 13:00 - 14:00 | 0 | 0 | 0 | 0 |
| 20.01.2016 14:00 - 15:00 | 0 | 0 | 0 | 0 |
| 20.01.2016 15:00 - 16:00 | 0 | 0 | 0 | 0 |
| 20.01.2016 16:00 - 17:00 | 0 | 0 | 0 | 0 |
| 20.01.2016 17:00 - 18:00 | 0 | 0 | 0 | 0 |
| 20.01.2016 18:00 - 19:00 | 0 | 0 | 0 | 0 |
| 20.01.2016 19:00 - 20:00 | 0 | 0 | 0 | 0 |
| 20.01.2016 20:00 - 21:00 | 0 | 0 | 0 | 0 |
| 20.01.2016 21:00 - 22:00 | 0 | 0 | 0 | 0 |
| 20.01.2016 22:00 - 23:00 | 0 | 0 | 0 | 0 |
| 20.01.2016 23:00 - 24:00 | 0 | 0 | 0 | 0 |
| 21.01.2016 00:00 - 01:00 | 0 | 0 | 0 | 0 |
| 21.01.2016 01:00 - 02:00 | 0 | 0 | 0 | 0 |
| 21.01.2016 02:00 - 03:00 | 0 | 0 | 0 | 0 |
| 21.01.2016 03:00 - 04:00 | 0 | 0 | 0 | 0 |
| 21.01.2016 04:00 - 05:00 | 500 | 0 | 0 | 0 |
| 21.01.2016 05:00 - 06:00 | 500 | 0 | 0 | 0 |
| 21.01.2016 06:00 - 07:00 | 0 | 0 | 0 | 0 |
| 21.01.2016 07:00 - 08:00 | 0 | 0 | 0 | 0 |
| 21.01.2016 08:00 - 09:00 | 0 | 0 | 0 | 0 |
| 21.01.2016 09:00 - 10:00 | 0 | 0 | 0 | 0 |
| 21.01.2016 10:00 - 11:00 | 0 | 0 | 0 | 0 |
| 21.01.2016 11:00 - 12:00 | 0 | 0 | 0 | 0 |
| 21.01.2016 12:00 - 13:00 | 0 | 0 | 0 | 0 |
| 21.01.2016 13:00 - 14:00 | 0 | 0 | 0 | 0 |
| 21.01.2016 14:00 - 15:00 | 0 | 0 | 0 | 0 |
| 21.01.2016 15:00 - 16:00 | 0 | 0 | 0 | 0 |
| 21.01.2016 16:00 - 17:00 | 0 | 0 | 0 | 0 |
| 21.01.2016 17:00 - 18:00 | 0 | 0 | 0 | 0 |
| 21.01.2016 18:00 - 19:00 | 0 | 0 | 0 | 0 |
| 21.01.2016 19:00 - 20:00 | 0 | 0 | 0 | 0 |
| 21.01.2016 20:00 - 21:00 | 0 | 0 | 0 | 0 |
| 21.01.2016 21:00 - 22:00 | 0 | 0 | 0 | 0 |
| 21.01.2016 22:00 - 23:00 | 0 | 0 | 0 | 0 |
| 21.01.2016 23:00 - 24:00 | 0 | 0 | 0 | 0 |
| 22.01.2016 00:00 - 01:00 | 0 | 0 | 0 | 0 |
| 22.01.2016 01:00 - 02:00 | 0 | 0 | 0 | 0 |
| 22.01.2016 02:00 - 03:00 | 0 | 0 | 0 | 0 |
| 22.01.2016 03:00 - 04:00 | 0 | 0 | 0 | 0 |
| 22.01.2016 04:00 - 05:00 | 0 | 0 | 0 | 0 |
| 22.01.2016 05:00 - 06:00 | 0 | 0 | 0 | 0 |
| 22.01.2016 06:00 - 07:00 | 0 | 0 | 0 | 0 |
| 22.01.2016 07:00 - 08:00 | 0 | 0 | 0 | 0 |
| 22.01.2016 08:00 - 09:00 | 0 | 0 | 0 | 0 |
| 22.01.2016 09:00 - 10:00 | 0 | 0 | 0 | 0 |
| 22.01.2016 10:00 - 11:00 | 0 | 0 | 0 | 0 |
| 22.01.2016 11:00 - 12:00 | 190 | 0 | 0 | 0 |
| 22.01.2016 12:00 - 13:00 | 340 | 0 | 0 | 0 |
| 22.01.2016 13:00 - 14:00 | 740 | 0 | 0 | 0 |
| 22.01.2016 14:00 - 15:00 | 900 | 0 | 0 | 0 |
| 22.01.2016 15:00 - 16:00 | 900 | 0 | 0 | 0 |
| 22.01.2016 16:00 - 17:00 | 900 | 0 | 0 | 0 |
| 22.01.2016 17:00 - 18:00 | 900 | 0 | 0 | 0 |
| 22.01.2016 18:00 - 19:00 | 900 | 0 | 0 | 0 |
| 22.01.2016 19:00 - 20:00 | 900 | 0 | 0 | 0 |
| 22.01.2016 20:00 - 21:00 | 900 | 0 | 0 | 0 |
| 22.01.2016 21:00 - 22:00 | 900 | 0 | 0 | 0 |
| 22.01.2016 22:00 - 23:00 | 900 | 0 | 0 | 0 |
| 22.01.2016 23:00 - 24:00 | 900 | 0 | 0 | 0 |
| 23.01.2016 00:00 - 01:00 | 900 | 0 | 0 | 0 |
| 23.01.2016 01:00 - 02:00 | 1168 | 0 | 0 | 0 |
| 23.01.2016 02:00 - 03:00 | 1168 | 0 | 0 | 0 |
| 23.01.2016 03:00 - 04:00 | 1168 | 0 | 0 | 0 |
| 23.01.2016 04:00 - 05:00 | 1168 | 0 | 0 | 0 |
| 23.01.2016 05:00 - 06:00 | 1168 | 0 | 0 | 0 |
| 23.01.2016 06:00 - 07:00 | 650 | 0 | 0 | 0 |
| 23.01.2016 07:00 - 08:00 | 650 | 0 | 0 | 0 |
| 23.01.2016 08:00 - 09:00 | 650 | 0 | 0 | 0 |
| 23.01.2016 09:00 - 10:00 | 650 | 0 | 0 | 0 |
| 23.01.2016 10:00 - 11:00 | 650 | 0 | 0 | 0 |
| 23.01.2016 11:00 - 12:00 | 650 | 0 | 0 | 0 |
| 23.01.2016 12:00 - 13:00 | 650 | 0 | 0 | 0 |
| 23.01.2016 13:00 - 14:00 | 650 | 0 | 0 | 0 |
| 23.01.2016 14:00 - 15:00 | 650 | 0 | 0 | 0 |
| 23.01.2016 15:00 - 16:00 | 650 | 0 | 0 | 0 |
| 23.01.2016 16:00 - 17:00 | 650 | 0 | 0 | 0 |
| 23.01.2016 17:00 - 18:00 | 650 | 0 | 0 | 0 |
| 23.01.2016 18:00 - 19:00 | 650 | 0 | 0 | 0 |
| 23.01.2016 19:00 - 20:00 | 650 | 0 | 0 | 0 |
| 23.01.2016 20:00 - 21:00 | 650 | 0 | 0 | 0 |
| 23.01.2016 21:00 - 22:00 | 650 | 0 | 0 | 0 |
| 23.01.2016 22:00 - 23:00 | 650 | 0 | 0 | 0 |
| 23.01.2016 23:00 - 24:00 | 650 | 0 | 0 | 0 |
| 24.01.2016 00:00 - 01:00 | 650 | 0 | 0 | 0 |
| 24.01.2016 01:00 - 02:00 | 650 | 0 | 0 | 0 |
| 24.01.2016 02:00 - 03:00 | 650 | 0 | 0 | 0 |
| 24.01.2016 03:00 - 04:00 | 650 | 0 | 0 | 0 |
| 24.01.2016 04:00 - 05:00 | 650 | 0 | 0 | 0 |
| 24.01.2016 05:00 - 06:00 | 650 | 0 | 0 | 0 |
| 24.01.2016 06:00 - 07:00 | 0 | 0 | 0 | 0 |
| 24.01.2016 07:00 - 08:00 | 0 | 0 | 0 | 0 |
| 24.01.2016 08:00 - 09:00 | 0 | 0 | 0 | 0 |
| 24.01.2016 09:00 - 10:00 | 0 | 0 | 0 | 0 |
| 24.01.2016 10:00 - 11:00 | 0 | 0 | 0 | 0 |
| 24.01.2016 11:00 - 12:00 | 0 | 0 | 0 | 0 |
| 24.01.2016 12:00 - 13:00 | 0 | 0 | 0 | 0 |
| 24.01.2016 13:00 - 14:00 | 0 | 0 | 0 | 0 |
| 24.01.2016 14:00 - 15:00 | 0 | 0 | 0 | 0 |
| 24.01.2016 15:00 - 16:00 | 0 | 0 | 0 | 0 |
| 24.01.2016 16:00 - 17:00 | 0 | -300 | 0 | 0 |
| 24.01.2016 17:00 - 18:00 | 0 | -300 | 0 | 0 |
| 24.01.2016 18:00 - 19:00 | 0 | -300 | 0 | 0 |
| 24.01.2016 19:00 - 20:00 | 0 | -700 | 0 | 0 |
| 24.01.2016 20:00 - 21:00 | 0 | -700 | 0 | 0 |
| 24.01.2016 21:00 - 22:00 | 0 | -1100 | 0 | 0 |
| 24.01.2016 22:00 - 23:00 | 0 | -1100 | 0 | 0 |
| 24.01.2016 23:00 - 24:00 | 0 | -2000 | 0 | 0 |
| 25.01.2016 00:00 - 01:00 | 0 | -2000 | 0 | 0 |
| 25.01.2016 01:00 - 02:00 | 0 | -2500 | 0 | 0 |
| 25.01.2016 02:00 - 03:00 | 0 | -2500 | 0 | 0 |
| 25.01.2016 03:00 - 04:00 | 0 | -2500 | 0 | 0 |
| 25.01.2016 04:00 - 05:00 | 0 | -2500 | 0 | 0 |
| 25.01.2016 05:00 - 06:00 | 0 | -2500 | 0 | 0 |
| 25.01.2016 06:00 - 07:00 | 0 | 0 | 0 | 0 |
| 25.01.2016 07:00 - 08:00 | 0 | 0 | 0 | 0 |
| 25.01.2016 08:00 - 09:00 | 0 | 0 | 0 | 0 |
| 25.01.2016 09:00 - 10:00 | 0 | 0 | 0 | 0 |
| 25.01.2016 10:00 - 11:00 | 0 | 0 | 0 | 0 |
| 25.01.2016 11:00 - 12:00 | 0 | 0 | 0 | 0 |
| 25.01.2016 12:00 - 13:00 | 0 | 0 | 0 | 0 |
| 25.01.2016 13:00 - 14:00 | 0 | 0 | 0 | 0 |
| 25.01.2016 14:00 - 15:00 | 0 | 0 | 0 | 0 |
| 25.01.2016 15:00 - 16:00 | 0 | 0 | 0 | 0 |
| 25.01.2016 16:00 - 17:00 | 0 | 0 | 0 | 0 |
| 25.01.2016 17:00 - 18:00 | 0 | 0 | 0 | 0 |
| 25.01.2016 18:00 - 19:00 | 0 | 0 | 0 | 0 |
| 25.01.2016 19:00 - 20:00 | 0 | 0 | 0 | 0 |
| 25.01.2016 20:00 - 21:00 | 0 | 0 | 0 | 0 |
| 25.01.2016 21:00 - 22:00 | 0 | 0 | 0 | 0 |
| 25.01.2016 22:00 - 23:00 | 0 | 0 | 0 | 0 |
| 25.01.2016 23:00 - 24:00 | 0 | 0 | 0 | 0 |
| 26.01.2016 00:00 - 01:00 | 0 | 0 | 0 | 0 |
| 26.01.2016 01:00 - 02:00 | 0 | 0 | 0 | 0 |
| 26.01.2016 02:00 - 03:00 | 0 | 0 | 0 | 0 |
| 26.01.2016 03:00 - 04:00 | 0 | 0 | 0 | 0 |
| 26.01.2016 04:00 - 05:00 | 0 | 0 | 0 | 0 |
| 26.01.2016 05:00 - 06:00 | 0 | 0 | 0 | 0 |
| 26.01.2016 06:00 - 07:00 | 0 | 0 | 0 | 0 |
| 26.01.2016 07:00 - 08:00 | 0 | 0 | 0 | 0 |
| 26.01.2016 08:00 - 09:00 | 0 | 0 | 0 | 0 |
| 26.01.2016 09:00 - 10:00 | 0 | 0 | 0 | 0 |
| 26.01.2016 10:00 - 11:00 | 0 | 0 | 0 | 0 |
| 26.01.2016 11:00 - 12:00 | 0 | 0 | 0 | 0 |
| 26.01.2016 12:00 - 13:00 | 0 | 0 | 0 | 0 |
| 26.01.2016 13:00 - 14:00 | 0 | 0 | 0 | 0 |
| 26.01.2016 14:00 - 15:00 | 0 | 0 | 0 | 0 |
| 26.01.2016 15:00 - 16:00 | 0 | 0 | 0 | 0 |
| 26.01.2016 16:00 - 17:00 | 0 | 0 | 0 | 0 |
| 26.01.2016 17:00 - 18:00 | 0 | 0 | 0 | 0 |
| 26.01.2016 18:00 - 19:00 | 0 | 0 | 0 | 0 |
| 26.01.2016 19:00 - 20:00 | 0 | 0 | 0 | 0 |
| 26.01.2016 20:00 - 21:00 | 0 | 0 | 0 | 0 |
| 26.01.2016 21:00 - 22:00 | 0 | 0 | 0 | 0 |
| 26.01.2016 22:00 - 23:00 | 0 | -500 | 0 | 0 |
| 26.01.2016 23:00 - 24:00 | 0 | -500 | 0 | 0 |
| 27.01.2016 00:00 - 01:00 | 0 | -500 | 0 | 0 |
| 27.01.2016 01:00 - 02:00 | 0 | -500 | 0 | 0 |
| 27.01.2016 02:00 - 03:00 | 0 | -500 | 0 | 0 |
| 27.01.2016 03:00 - 04:00 | 0 | -500 | 0 | 0 |
| 27.01.2016 04:00 - 05:00 | 0 | -500 | 0 | 0 |
| 27.01.2016 05:00 - 06:00 | 0 | -500 | 0 | 0 |
| 27.01.2016 06:00 - 07:00 | 0 | 0 | 0 | 0 |
| 27.01.2016 07:00 - 08:00 | 0 | 0 | 0 | 0 |
| 27.01.2016 08:00 - 09:00 | 0 | 0 | 0 | 0 |
| 27.01.2016 09:00 - 10:00 | 0 | 0 | 0 | 0 |
| 27.01.2016 10:00 - 11:00 | 0 | 0 | 0 | 0 |
| 27.01.2016 11:00 - 12:00 | 0 | 0 | 0 | 0 |
| 27.01.2016 12:00 - 13:00 | 0 | 0 | 0 | 0 |
| 27.01.2016 13:00 - 14:00 | 0 | 0 | 0 | 0 |
| 27.01.2016 14:00 - 15:00 | 0 | 0 | 0 | 0 |
| 27.01.2016 15:00 - 16:00 | 0 | 0 | 0 | 0 |
| 27.01.2016 16:00 - 17:00 | 0 | 0 | 0 | 0 |
| 27.01.2016 17:00 - 18:00 | 0 | 0 | 0 | 0 |
| 27.01.2016 18:00 - 19:00 | 0 | 0 | 0 | 0 |
| 27.01.2016 19:00 - 20:00 | 0 | 0 | 0 | 0 |
| 27.01.2016 20:00 - 21:00 | 0 | 0 | 0 | 0 |
| 27.01.2016 21:00 - 22:00 | 0 | 0 | 0 | 0 |
| 27.01.2016 22:00 - 23:00 | 0 | 0 | 0 | 0 |
| 27.01.2016 23:00 - 24:00 | 0 | 0 | 0 | 0 |
| 28.01.2016 00:00 - 01:00 | 0 | 0 | 0 | 0 |
| 28.01.2016 01:00 - 02:00 | 0 | 0 | 0 | 0 |
| 28.01.2016 02:00 - 03:00 | 790 | 0 | 0 | 0 |
| 28.01.2016 03:00 - 04:00 | 790 | 0 | 0 | 0 |
| 28.01.2016 04:00 - 05:00 | 790 | 0 | 0 | 0 |
| 28.01.2016 05:00 - 06:00 | 790 | 0 | 0 | 0 |
| 28.01.2016 06:00 - 07:00 | 0 | 0 | 0 | 0 |
| 28.01.2016 07:00 - 08:00 | 0 | 0 | 0 | 0 |
| 28.01.2016 08:00 - 09:00 | 0 | 0 | 0 | 0 |
| 28.01.2016 09:00 - 10:00 | 0 | 0 | 0 | 0 |
| 28.01.2016 10:00 - 11:00 | 0 | 0 | 0 | 0 |
| 28.01.2016 11:00 - 12:00 | 0 | 0 | 0 | 0 |
| 28.01.2016 12:00 - 13:00 | 0 | 0 | 0 | 0 |
| 28.01.2016 13:00 - 14:00 | 0 | 0 | 0 | 0 |
| 28.01.2016 14:00 - 15:00 | 0 | 0 | 0 | 0 |
| 28.01.2016 15:00 - 16:00 | 0 | 0 | 0 | 0 |
| 28.01.2016 16:00 - 17:00 | 0 | 0 | 0 | 0 |
| 28.01.2016 17:00 - 18:00 | 0 | 0 | 0 | 0 |
| 28.01.2016 18:00 - 19:00 | 0 | 0 | 0 | 0 |
| 28.01.2016 19:00 - 20:00 | 0 | 0 | 0 | 0 |
| 28.01.2016 20:00 - 21:00 | 0 | 0 | 0 | 0 |
| 28.01.2016 21:00 - 22:00 | 0 | 0 | 0 | 0 |
| 28.01.2016 22:00 - 23:00 | 0 | 0 | 0 | 0 |
| 28.01.2016 23:00 - 24:00 | 0 | 0 | 0 | 0 |
| 29.01.2016 00:00 - 01:00 | 0 | 0 | 0 | 0 |
| 29.01.2016 01:00 - 02:00 | 0 | 0 | 0 | 0 |
| 29.01.2016 02:00 - 03:00 | 0 | 0 | 0 | 0 |
| 29.01.2016 03:00 - 04:00 | 0 | 0 | 0 | 0 |
| 29.01.2016 04:00 - 05:00 | 0 | 0 | 0 | 0 |
| 29.01.2016 05:00 - 06:00 | 0 | 0 | 0 | 0 |
| 29.01.2016 06:00 - 07:00 | 0 | 0 | 0 | 0 |
| 29.01.2016 07:00 - 08:00 | 0 | 0 | 0 | 0 |
| 29.01.2016 08:00 - 09:00 | 0 | 0 | 0 | 0 |
| 29.01.2016 09:00 - 10:00 | 0 | 0 | 0 | 0 |
| 29.01.2016 10:00 - 11:00 | 0 | 0 | 0 | 0 |
| 29.01.2016 11:00 - 12:00 | 0 | 0 | 0 | 0 |
| 29.01.2016 12:00 - 13:00 | 0 | 0 | 0 | 0 |
| 29.01.2016 13:00 - 14:00 | 0 | 0 | 0 | 0 |
| 29.01.2016 14:00 - 15:00 | 0 | 0 | 0 | 0 |
| 29.01.2016 15:00 - 16:00 | 0 | 0 | 0 | 0 |
| 29.01.2016 16:00 - 17:00 | 0 | 0 | 0 | 0 |
| 29.01.2016 17:00 - 18:00 | 0 | 0 | 0 | 0 |
| 29.01.2016 18:00 - 19:00 | 0 | 0 | 0 | 0 |
| 29.01.2016 19:00 - 20:00 | 0 | 0 | 0 | 0 |
| 29.01.2016 20:00 - 21:00 | 0 | 0 | 0 | 0 |
| 29.01.2016 21:00 - 22:00 | 0 | 0 | 0 | 0 |
| 29.01.2016 22:00 - 23:00 | 0 | 0 | 0 | 0 |
| 29.01.2016 23:00 - 24:00 | 0 | 0 | 0 | 0 |
| 30.01.2016 00:00 - 01:00 | 0 | 0 | 0 | 0 |
| 30.01.2016 01:00 - 02:00 | 0 | 0 | 0 | 0 |
| 30.01.2016 02:00 - 03:00 | 0 | 0 | 0 | 0 |
| 30.01.2016 03:00 - 04:00 | 0 | 0 | 0 | 0 |
| 30.01.2016 04:00 - 05:00 | 0 | 0 | 0 | 0 |
| 30.01.2016 05:00 - 06:00 | 0 | 0 | 0 | 0 |
| 30.01.2016 06:00 - 07:00 | 0 | 0 | 0 | 0 |
| 30.01.2016 07:00 - 08:00 | 0 | 0 | 0 | 0 |
| 30.01.2016 08:00 - 09:00 | 0 | 0 | 0 | 0 |
| 30.01.2016 09:00 - 10:00 | 0 | 0 | 0 | 0 |
| 30.01.2016 10:00 - 11:00 | 0 | 0 | 0 | 0 |
| 30.01.2016 11:00 - 12:00 | 0 | 0 | 0 | 0 |
| 30.01.2016 12:00 - 13:00 | 0 | 0 | 0 | 0 |
| 30.01.2016 13:00 - 14:00 | 0 | 0 | 0 | 0 |
| 30.01.2016 14:00 - 15:00 | 0 | 0 | 0 | 0 |
| 30.01.2016 15:00 - 16:00 | 0 | 0 | 0 | 0 |
| 30.01.2016 16:00 - 17:00 | 0 | 0 | 0 | 0 |
| 30.01.2016 17:00 - 18:00 | 0 | 0 | 0 | 0 |
| 30.01.2016 18:00 - 19:00 | 0 | 0 | 0 | 0 |
| 30.01.2016 19:00 - 20:00 | 0 | 0 | 0 | 0 |
| 30.01.2016 20:00 - 21:00 | 0 | 0 | 0 | 0 |
| 30.01.2016 21:00 - 22:00 | 0 | 0 | 0 | 0 |
| 30.01.2016 22:00 - 23:00 | 0 | 0 | 0 | 0 |
| 30.01.2016 23:00 - 24:00 | 0 | 0 | 0 | 0 |
| 31.01.2016 00:00 - 01:00 | 0 | 0 | 0 | 0 |
| 31.01.2016 01:00 - 02:00 | 0 | 0 | 0 | 0 |
| 31.01.2016 02:00 - 03:00 | 0 | 0 | 0 | 0 |
| 31.01.2016 03:00 - 04:00 | 0 | 0 | 0 | 0 |
| 31.01.2016 04:00 - 05:00 | 0 | 0 | 0 | 0 |
| 31.01.2016 05:00 - 06:00 | 0 | 0 | 0 | 0 |
| 31.01.2016 06:00 - 07:00 | 0 | 0 | 0 | 0 |
| 31.01.2016 07:00 - 08:00 | 0 | 0 | 0 | 0 |
| 31.01.2016 08:00 - 09:00 | 0 | 0 | 0 | 0 |
| 31.01.2016 09:00 - 10:00 | 0 | 0 | 0 | 0 |
| 31.01.2016 10:00 - 11:00 | 0 | 0 | 0 | 0 |
| 31.01.2016 11:00 - 12:00 | 0 | 0 | 0 | 0 |
| 31.01.2016 12:00 - 13:00 | 0 | 0 | 0 | 0 |
| 31.01.2016 13:00 - 14:00 | 0 | 0 | 0 | 0 |
| 31.01.2016 14:00 - 15:00 | 0 | 0 | 0 | 0 |
| 31.01.2016 15:00 - 16:00 | 0 | 0 | 0 | 0 |
| 31.01.2016 16:00 - 17:00 | 0 | -300 | 0 | 0 |
| 31.01.2016 17:00 - 18:00 | 0 | -300 | 0 | 0 |
| 31.01.2016 18:00 - 19:00 | 0 | -300 | 0 | 0 |
| 31.01.2016 19:00 - 20:00 | 0 | -300 | 0 | 0 |
| 31.01.2016 20:00 - 21:00 | 0 | -300 | 0 | 0 |
| 31.01.2016 21:00 - 22:00 | 0 | -300 | 0 | 0 |
| 31.01.2016 22:00 - 23:00 | 0 | -300 | 0 | 0 |
| 31.01.2016 23:00 - 24:00 | 0 | -300 | 0 | 0 |
| 01.02.2016 00:00 - 01:00 | 0 | -300 | 0 | 0 |
| 01.02.2016 01:00 - 02:00 | 0 | -300 | 0 | 0 |
| 01.02.2016 02:00 - 03:00 | 0 | -300 | 0 | 0 |
| 01.02.2016 03:00 - 04:00 | 0 | -300 | 0 | 0 |
| 01.02.2016 04:00 - 05:00 | 0 | -300 | 0 | 0 |
| 01.02.2016 05:00 - 06:00 | 0 | -300 | 0 | 0 |